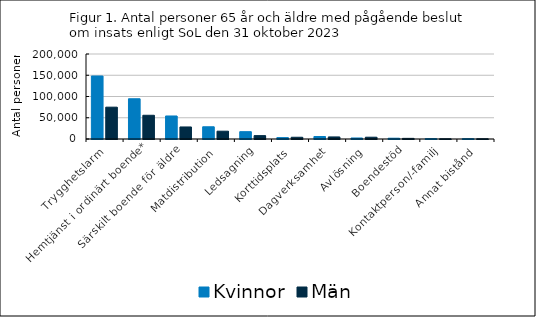
| Category | Kvinnor | Män |
|---|---|---|
| Trygghetslarm | 148272 | 74900 |
| Hemtjänst i ordinärt boende* | 94680 | 55831 |
| Särskilt boende för äldre | 54169 | 28328 |
| Matdistribution | 28752 | 18368 |
| Ledsagning | 17240 | 7952 |
| Korttidsplats | 3245 | 4100 |
| Dagverksamhet | 5865 | 4853 |
| Avlösning | 2377 | 4224 |
| Boendestöd | 1821 | 1474 |
| Kontaktperson/-familj | 870 | 549 |
| Annat bistånd | 755 | 562 |